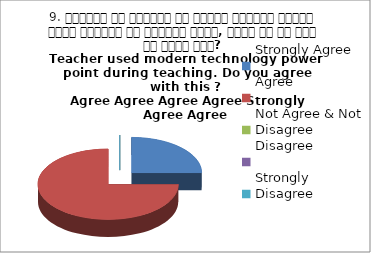
| Category | 9. शिक्षक ने शिक्षण के दौरान आधुनिक तकनीक पावर पॉइन्ट का प्रयोग किया, क्या आप इस बात से सहमत हैं? 
Teacher used modern technology power point during teaching. Do you agree with this ?
 Agree Agree Agree Agree Strongly Agree Agree |
|---|---|
| Strongly Agree | 1 |
| Agree | 3 |
| Not Agree & Not Disagree | 0 |
| Disagree | 0 |
| Strongly Disagree | 0 |